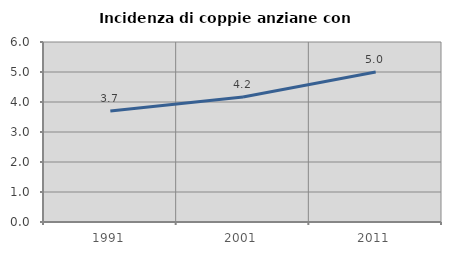
| Category | Incidenza di coppie anziane con figli |
|---|---|
| 1991.0 | 3.704 |
| 2001.0 | 4.167 |
| 2011.0 | 5 |